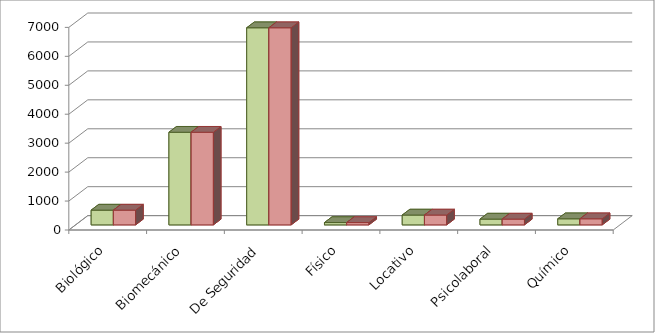
| Category | Series 0 | Series 1 |
|---|---|---|
| Biológico | 510 | 510 |
| Biomecánico | 3200 | 3200 |
| De Seguridad | 6810 | 6810 |
| Físico | 80 | 80 |
| Locativo | 340 | 340 |
| Psicolaboral | 200 | 200 |
| Químico | 210 | 210 |